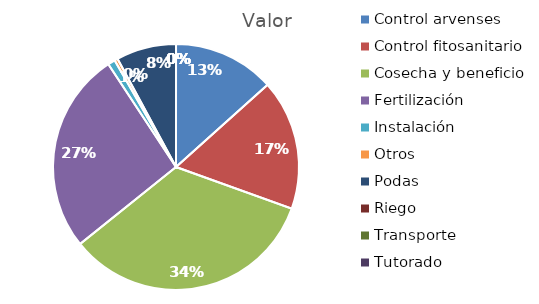
| Category | Valor |
|---|---|
| Control arvenses | 15434564 |
| Control fitosanitario | 19809716 |
| Cosecha y beneficio | 38999852.286 |
| Fertilización | 30626064 |
| Instalación | 1108979.5 |
| Otros | 486128 |
| Podas | 9114900 |
| Riego | 0 |
| Transporte | 0 |
| Tutorado | 0 |